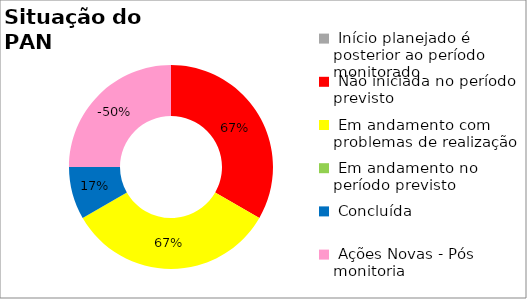
| Category | Series 0 |
|---|---|
|  Início planejado é posterior ao período monitorado | 0 |
|  Não iniciada no período previsto | 0.667 |
|  Em andamento com problemas de realização | 0.667 |
|  Em andamento no período previsto  | 0 |
|  Concluída | 0.167 |
|  Ações Novas - Pós monitoria | -0.5 |